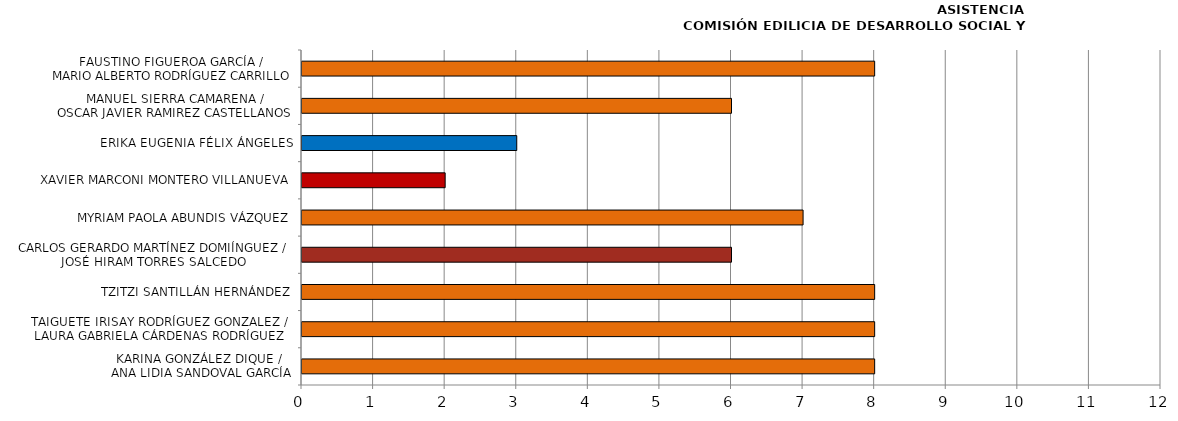
| Category | Series 0 |
|---|---|
| KARINA GONZÁLEZ DIQUE / 
ANA LIDIA SANDOVAL GARCÍA | 8 |
| TAIGUETE IRISAY RODRÍGUEZ GONZALEZ /
LAURA GABRIELA CÁRDENAS RODRÍGUEZ | 8 |
| TZITZI SANTILLÁN HERNÁNDEZ | 8 |
| CARLOS GERARDO MARTÍNEZ DOMIÍNGUEZ /
JOSÉ HIRAM TORRES SALCEDO | 6 |
| MYRIAM PAOLA ABUNDIS VÁZQUEZ | 7 |
| XAVIER MARCONI MONTERO VILLANUEVA | 2 |
| ERIKA EUGENIA FÉLIX ÁNGELES | 3 |
| MANUEL SIERRA CAMARENA /
OSCAR JAVIER RAMIREZ CASTELLANOS | 6 |
| FAUSTINO FIGUEROA GARCÍA /
MARIO ALBERTO RODRÍGUEZ CARRILLO | 8 |